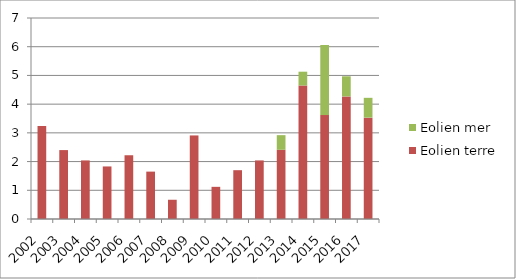
| Category | Eolien terre | Eolien mer |
|---|---|---|
| 2002.0 | 3.24 | 0 |
| 2003.0 | 2.4 | 0 |
| 2004.0 | 2.04 | 0 |
| 2005.0 | 1.83 | 0 |
| 2006.0 | 2.22 | 0 |
| 2007.0 | 1.65 | 0 |
| 2008.0 | 0.67 | 0 |
| 2009.0 | 2.91 | 0 |
| 2010.0 | 1.12 | 0 |
| 2011.0 | 1.7 | 0 |
| 2012.0 | 2.04 | 0 |
| 2013.0 | 2.41 | 0.51 |
| 2014.0 | 4.65 | 0.48 |
| 2015.0 | 3.62 | 2.44 |
| 2016.0 | 4.27 | 0.7 |
| 2017.0 | 3.53 | 0.69 |